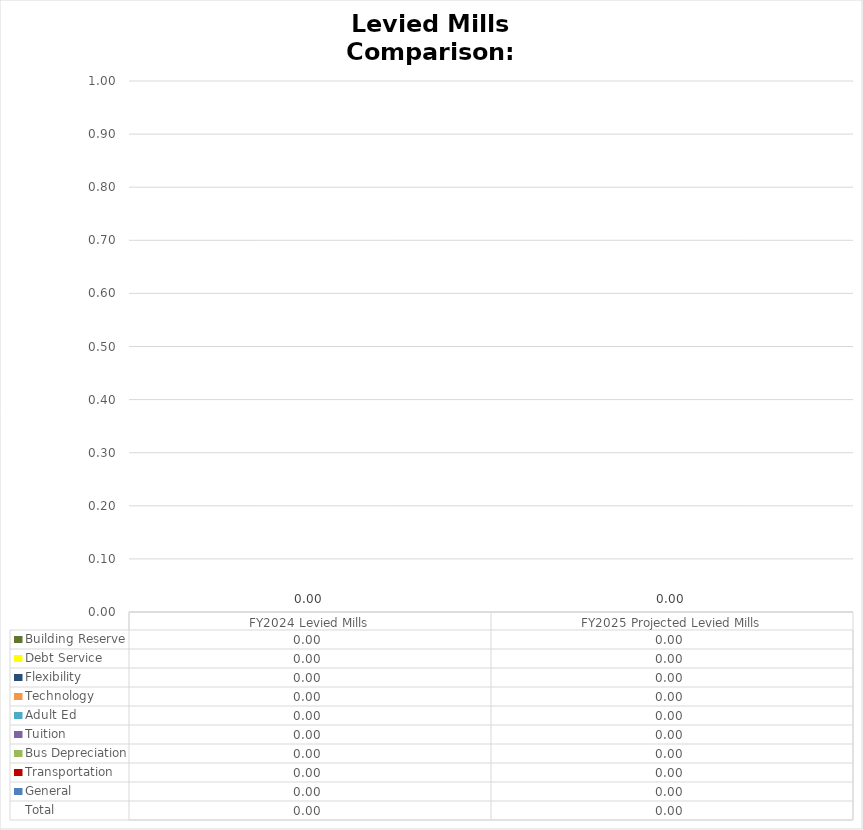
| Category |  General  |  Transportation  |  Bus Depreciation  |  Tuition  |  Adult Ed  |  Technology  |  Flexibility  |  Debt Service  |  Building Reserve  |
|---|---|---|---|---|---|---|---|---|---|
| FY2024 Levied Mills | 0 | 0 | 0 | 0 | 0 | 0 | 0 | 0 | 0 |
|  FY2025 Projected Levied Mills  | 0 | 0 | 0 | 0 | 0 | 0 | 0 | 0 | 0 |